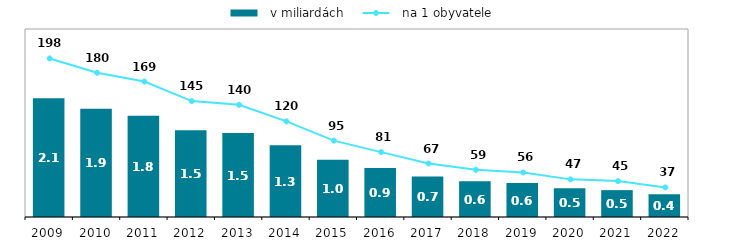
| Category |   v miliardách |
|---|---|
| 2009.0 | 2.082 |
| 2010.0 | 1.898 |
| 2011.0 | 1.779 |
| 2012.0 | 1.524 |
| 2013.0 | 1.474 |
| 2014.0 | 1.26 |
| 2015.0 | 1.007 |
| 2016.0 | 0.858 |
| 2017.0 | 0.709 |
| 2018.0 | 0.628 |
| 2019.0 | 0.595 |
| 2020.0 | 0.503 |
| 2021.0 | 0.472 |
| 2022.0 | 0.4 |